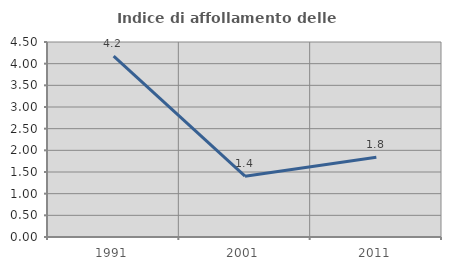
| Category | Indice di affollamento delle abitazioni  |
|---|---|
| 1991.0 | 4.176 |
| 2001.0 | 1.403 |
| 2011.0 | 1.843 |